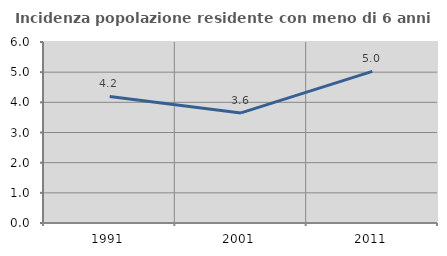
| Category | Incidenza popolazione residente con meno di 6 anni |
|---|---|
| 1991.0 | 4.195 |
| 2001.0 | 3.649 |
| 2011.0 | 5.025 |